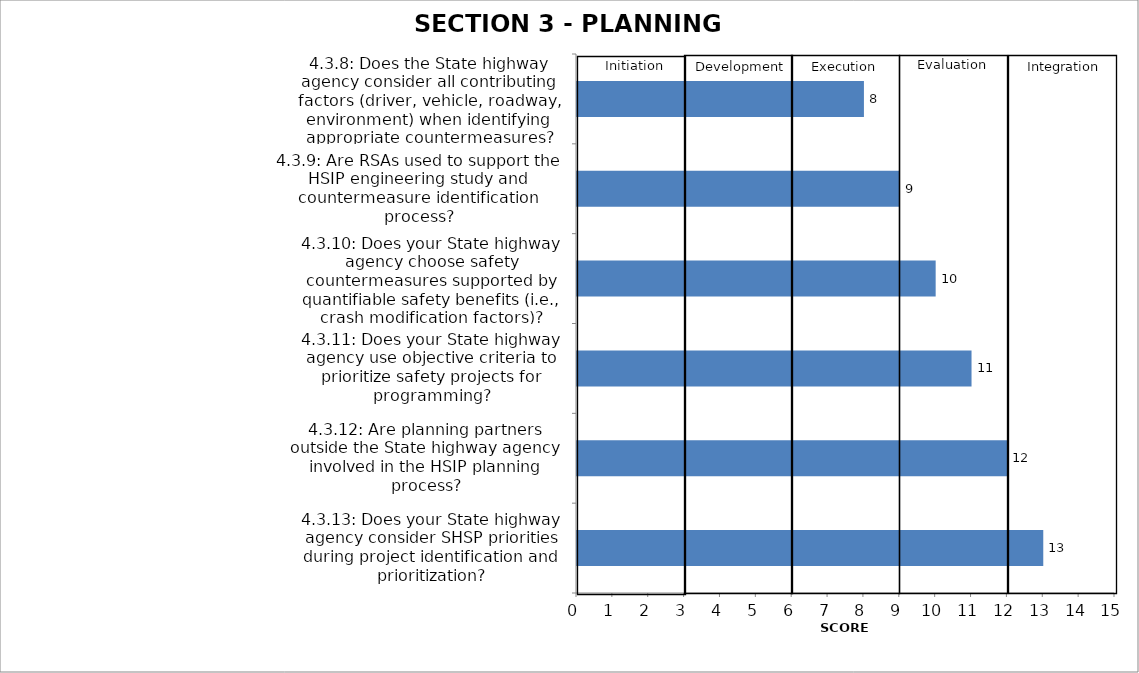
| Category | Series 0 |
|---|---|
| 4.3.8: Does the State highway agency consider all contributing factors (driver, vehicle, roadway, environment) when identifying appropriate countermeasures? | 8 |
| 4.3.9: Are RSAs used to support the HSIP engineering study and countermeasure identification process? | 9 |
| 4.3.10: Does your State highway agency choose safety countermeasures supported by quantifiable safety benefits (i.e., crash modification factors)? | 10 |
| 4.3.11: Does your State highway agency use objective criteria to prioritize safety projects for programming? | 11 |
| 4.3.12: Are planning partners outside the State highway agency involved in the HSIP planning process? | 12 |
| 4.3.13: Does your State highway agency consider SHSP priorities during project identification and prioritization? | 13 |